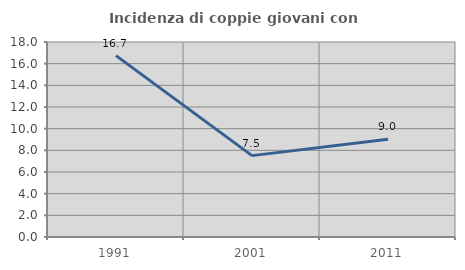
| Category | Incidenza di coppie giovani con figli |
|---|---|
| 1991.0 | 16.743 |
| 2001.0 | 7.511 |
| 2011.0 | 9.031 |